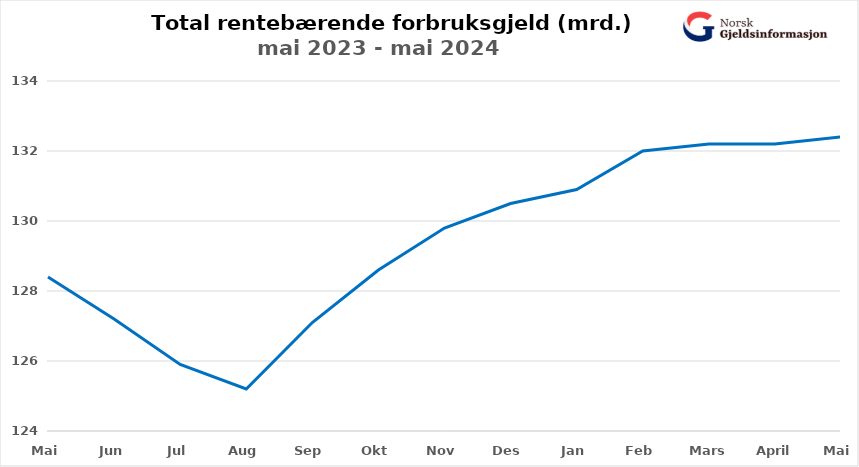
| Category | Rentebærende forbruksgjeld |
|---|---|
| Mai | 128.4 |
| Jun | 127.2 |
| Jul | 125.9 |
| Aug | 125.2 |
| Sep | 127.1 |
| Okt | 128.6 |
| Nov | 129.8 |
| Des | 130.5 |
| Jan | 130.9 |
| Feb | 132 |
| Mars | 132.2 |
| April | 132.2 |
| Mai | 132.4 |